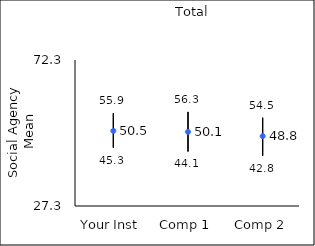
| Category | 25th percentile | 75th percentile | Mean |
|---|---|---|---|
| Your Inst | 45.3 | 55.9 | 50.46 |
| Comp 1 | 44.1 | 56.3 | 50.14 |
| Comp 2 | 42.8 | 54.5 | 48.82 |